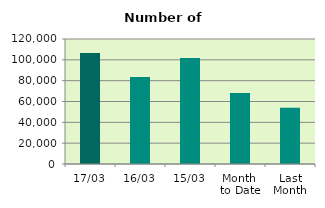
| Category | Series 0 |
|---|---|
| 17/03 | 106644 |
| 16/03 | 83590 |
| 15/03 | 101698 |
| Month 
to Date | 68263.846 |
| Last
Month | 54034.8 |